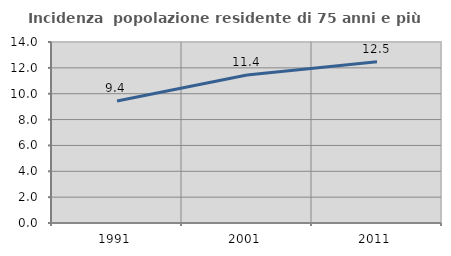
| Category | Incidenza  popolazione residente di 75 anni e più |
|---|---|
| 1991.0 | 9.441 |
| 2001.0 | 11.441 |
| 2011.0 | 12.478 |